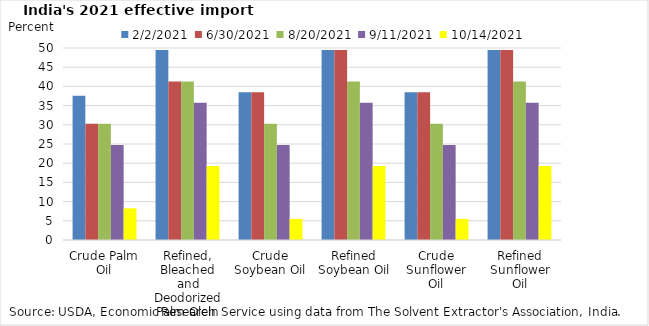
| Category | 2/2/2021 | 6/30/2021 | 8/20/2021 | 9/11/2021 | 10/14/2021 |
|---|---|---|---|---|---|
| Crude Palm Oil | 37.55 | 30.25 | 30.25 | 24.75 | 8.25 |
| Refined, Bleached and Deodorized Palm Olein | 49.5 | 41.25 | 41.25 | 35.75 | 19.25 |
| Crude Soybean Oil | 38.5 | 38.5 | 30.25 | 24.75 | 5.5 |
| Refined Soybean Oil | 49.5 | 49.5 | 41.25 | 35.75 | 19.25 |
| Crude Sunflower Oil | 38.5 | 38.5 | 30.25 | 24.75 | 5.5 |
| Refined Sunflower Oil | 49.5 | 49.5 | 41.25 | 35.75 | 19.25 |